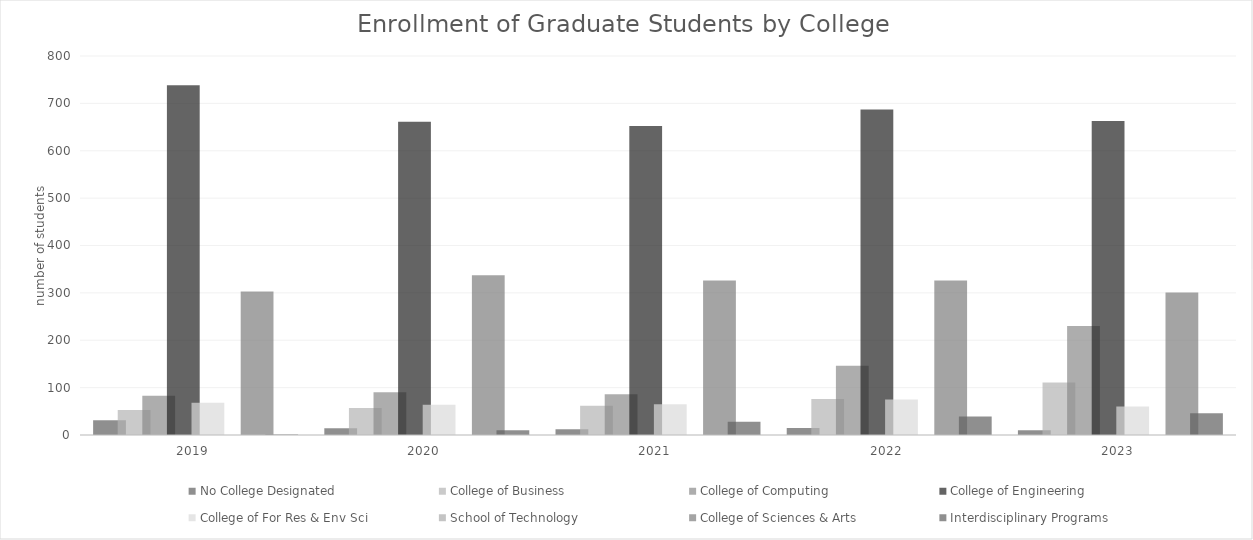
| Category | No College Designated | College of Business | College of Computing | College of Engineering | College of For Res & Env Sci | School of Technology | College of Sciences & Arts | Interdisciplinary Programs |
|---|---|---|---|---|---|---|---|---|
| 2019  | 31 | 53 | 83 | 738 | 68 | 0 | 303 | 1 |
| 2020  | 14 | 57 | 90 | 661 | 64 | 0 | 337 | 10 |
| 2021  | 12 | 62 | 86 | 652 | 65 | 0 | 326 | 28 |
| 2022  | 15 | 76 | 146 | 687 | 75 | 0 | 326 | 39 |
| 2023  | 10 | 111 | 230 | 663 | 60 | 0 | 301 | 46 |